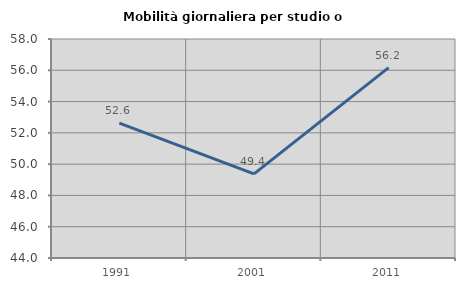
| Category | Mobilità giornaliera per studio o lavoro |
|---|---|
| 1991.0 | 52.616 |
| 2001.0 | 49.377 |
| 2011.0 | 56.174 |